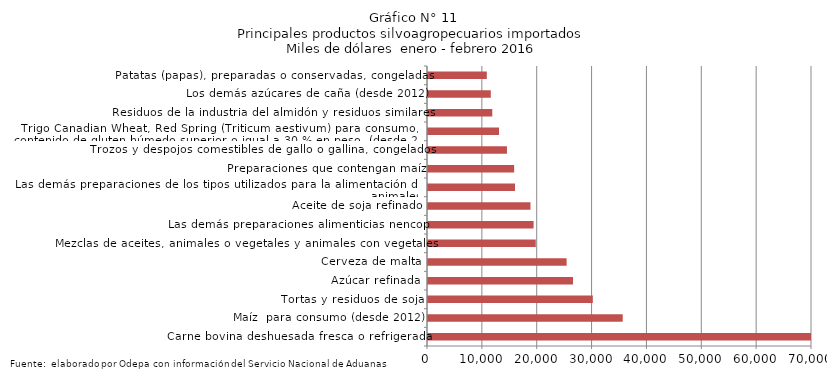
| Category | Series 0 |
|---|---|
| Carne bovina deshuesada fresca o refrigerada | 120018.994 |
| Maíz  para consumo (desde 2012) | 35493.087 |
| Tortas y residuos de soja | 30046.056 |
| Azúcar refinada | 26432.567 |
| Cerveza de malta | 25271.379 |
| Mezclas de aceites, animales o vegetales y animales con vegetales | 19643.961 |
| Las demás preparaciones alimenticias nencop | 19247.866 |
| Aceite de soja refinado | 18681.475 |
| Las demás preparaciones de los tipos utilizados para la alimentación de los animales | 15857.68 |
| Preparaciones que contengan maíz | 15705.077 |
| Trozos y despojos comestibles de gallo o gallina, congelados | 14395.603 |
| Trigo Canadian Wheat, Red Spring (Triticum aestivum) para consumo, con contenido de gluten húmedo superior o igual a 30 % en peso  (desde 2012) | 12942.843 |
| Residuos de la industria del almidón y residuos similares | 11717.629 |
| Los demás azúcares de caña (desde 2012) | 11447.926 |
| Patatas (papas), preparadas o conservadas, congeladas | 10718.945 |